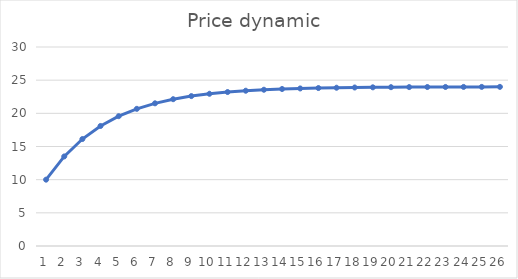
| Category | Series 0 |
|---|---|
| 0 | 10 |
| 1 | 13.5 |
| 2 | 16.125 |
| 3 | 18.094 |
| 4 | 19.57 |
| 5 | 20.678 |
| 6 | 21.508 |
| 7 | 22.131 |
| 8 | 22.598 |
| 9 | 22.949 |
| 10 | 23.212 |
| 11 | 23.409 |
| 12 | 23.557 |
| 13 | 23.667 |
| 14 | 23.751 |
| 15 | 23.813 |
| 16 | 23.86 |
| 17 | 23.895 |
| 18 | 23.921 |
| 19 | 23.941 |
| 20 | 23.956 |
| 21 | 23.967 |
| 22 | 23.975 |
| 23 | 23.981 |
| 24 | 23.986 |
| 25 | 23.989 |